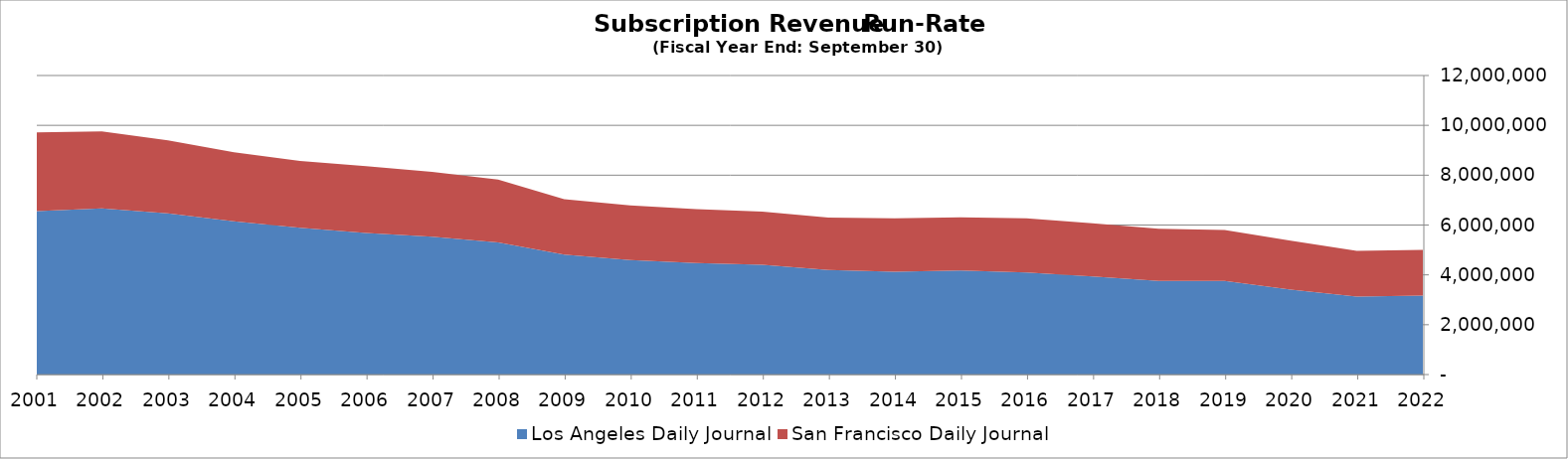
| Category | Los Angeles Daily Journal | San Francisco Daily Journal |
|---|---|---|
| 2022.0 | 3166590 | 1836090 |
| 2021.0 | 3132000 | 1827000 |
| 2020.0 | 3412000 | 1961900 |
| 2019.0 | 3753200 | 2047200 |
| 2018.0 | 3762000 | 2090000 |
| 2017.0 | 3936000 | 2132000 |
| 2016.0 | 4100400 | 2170800 |
| 2015.0 | 4176400 | 2127600 |
| 2014.0 | 4131000 | 2142000 |
| 2013.0 | 4200000 | 2100000 |
| 2012.0 | 4410000 | 2131500 |
| 2011.0 | 4470200 | 2163000 |
| 2010.0 | 4595500 | 2191700 |
| 2009.0 | 4816350 | 2217600 |
| 2008.0 | 5304000 | 2516000 |
| 2007.0 | 5536100 | 2601300 |
| 2006.0 | 5681100 | 2677300 |
| 2005.0 | 5888000 | 2688000 |
| 2004.0 | 6154400 | 2763200 |
| 2003.0 | 6466000 | 2928000 |
| 2002.0 | 6664000 | 3094000 |
| 2001.0 | 6555000 | 3162500 |